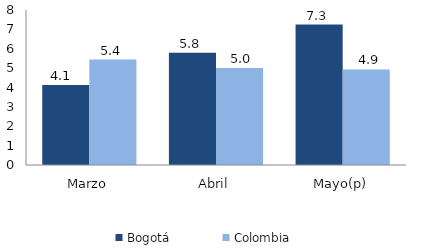
| Category | Bogotá | Colombia |
|---|---|---|
| Marzo | 4.125 | 5.439 |
| Abril | 5.789 | 5.013 |
| Mayo(p) | 7.251 | 4.93 |